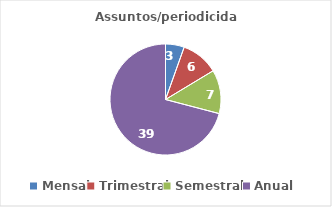
| Category | Series 0 |
|---|---|
| Mensal | 3 |
| Trimestral | 6 |
| Semestral  | 7 |
| Anual | 39 |